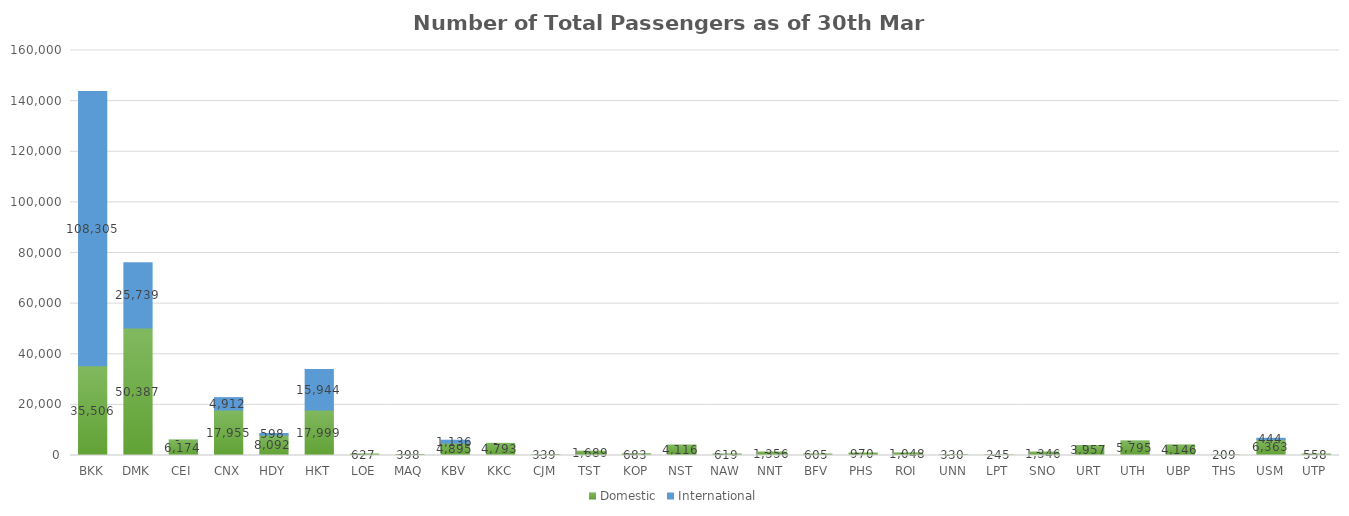
| Category | Domestic | International |
|---|---|---|
| BKK | 35506 | 108305 |
| DMK | 50387 | 25739 |
| CEI | 6174 | 0 |
| CNX | 17955 | 4912 |
| HDY | 8092 | 598 |
| HKT | 17999 | 15944 |
| LOE | 627 | 0 |
| MAQ | 398 | 0 |
| KBV | 4895 | 1136 |
| KKC | 4793 | 0 |
| CJM | 339 | 0 |
| TST | 1689 | 0 |
| KOP | 683 | 0 |
| NST | 4116 | 0 |
| NAW | 619 | 0 |
| NNT | 1356 | 0 |
| BFV | 605 | 0 |
| PHS | 970 | 0 |
| ROI | 1048 | 0 |
| UNN | 330 | 0 |
| LPT | 245 | 0 |
| SNO | 1346 | 0 |
| URT | 3957 | 0 |
| UTH | 5795 | 0 |
| UBP | 4146 | 0 |
| THS | 209 | 0 |
| USM | 6363 | 444 |
| UTP | 558 | 0 |